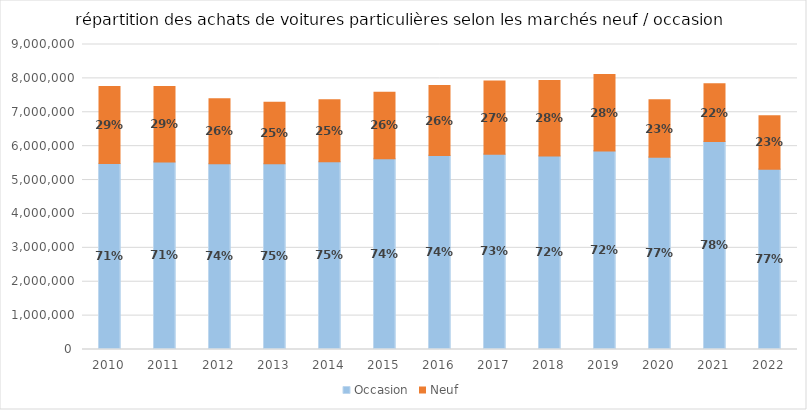
| Category | Occasion | Neuf |
|---|---|---|
| 2010.0 | 5485082 | 2274382 |
| 2011.0 | 5535606 | 2227506 |
| 2012.0 | 5480632 | 1920672 |
| 2013.0 | 5478690 | 1816678 |
| 2014.0 | 5542547 | 1827179 |
| 2015.0 | 5632083 | 1955937 |
| 2016.0 | 5726790 | 2060169 |
| 2017.0 | 5763309 | 2157670 |
| 2018.0 | 5712659 | 2223581 |
| 2019.0 | 5855065 | 2258277 |
| 2020.0 | 5673976 | 1693530 |
| 2021.0 | 6134019 | 1708675 |
| 2022.0 | 5320980 | 1576950 |